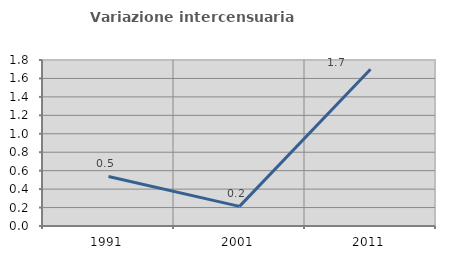
| Category | Variazione intercensuaria annua |
|---|---|
| 1991.0 | 0.537 |
| 2001.0 | 0.212 |
| 2011.0 | 1.699 |